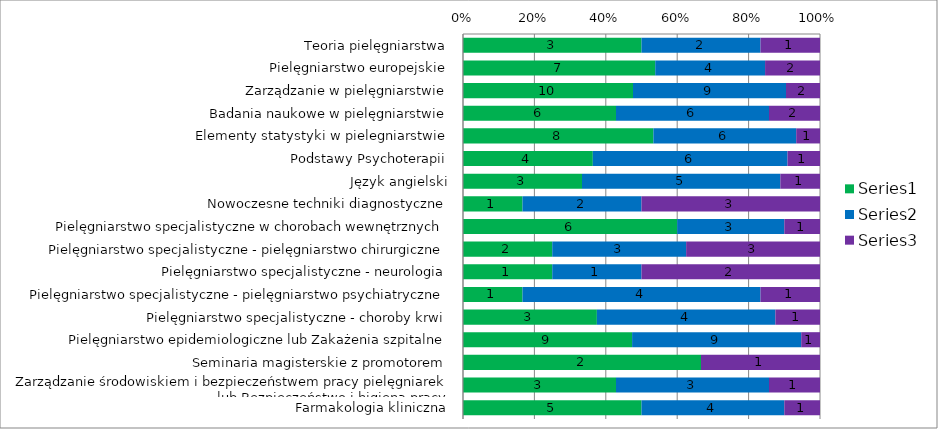
| Category | Series 0 | Series 1 | Series 2 |
|---|---|---|---|
| Teoria pielęgniarstwa | 3 | 2 | 1 |
| Pielęgniarstwo europejskie | 7 | 4 | 2 |
| Zarządzanie w pielęgniarstwie | 10 | 9 | 2 |
| Badania naukowe w pielęgniarstwie | 6 | 6 | 2 |
| Elementy statystyki w pielegniarstwie | 8 | 6 | 1 |
| Podstawy Psychoterapii | 4 | 6 | 1 |
| Język angielski | 3 | 5 | 1 |
| Nowoczesne techniki diagnostyczne | 1 | 2 | 3 |
| Pielęgniarstwo specjalistyczne w chorobach wewnętrznych | 6 | 3 | 1 |
| Pielęgniarstwo specjalistyczne - pielęgniarstwo chirurgiczne | 2 | 3 | 3 |
| Pielęgniarstwo specjalistyczne - neurologia | 1 | 1 | 2 |
| Pielęgniarstwo specjalistyczne - pielęgniarstwo psychiatryczne | 1 | 4 | 1 |
| Pielęgniarstwo specjalistyczne - choroby krwi | 3 | 4 | 1 |
| Pielęgniarstwo epidemiologiczne lub Zakażenia szpitalne | 9 | 9 | 1 |
| Seminaria magisterskie z promotorem | 2 | 0 | 1 |
| Zarządzanie środowiskiem i bezpieczeństwem pracy pielęgniarek lub Bezpieczeństwo i higiena pracy | 3 | 3 | 1 |
| Farmakologia kliniczna | 5 | 4 | 1 |